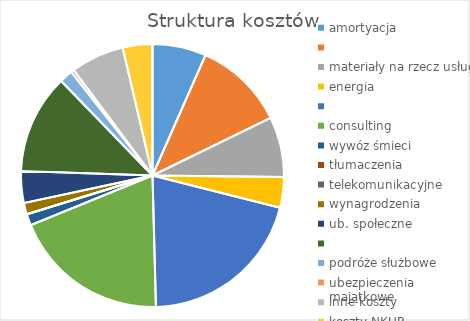
| Category | Series 0 |
|---|---|
| amortyacja | 0.066 |
|  | 0.112 |
| materiały na rzecz usług | 0.074 |
| energia | 0.038 |
|  | 0.206 |
| consulting | 0.193 |
| wywóz śmieci | 0.014 |
| tłumaczenia | 0 |
| telekomunikacyjne | 0 |
| wynagrodzenia | 0.014 |
| ub. społeczne | 0.039 |
|  | 0.122 |
| podróże służbowe | 0.016 |
| ubezpieczenia majątkowe | 0.004 |
| inne koszty | 0.066 |
| koszty NKUP | 0.037 |